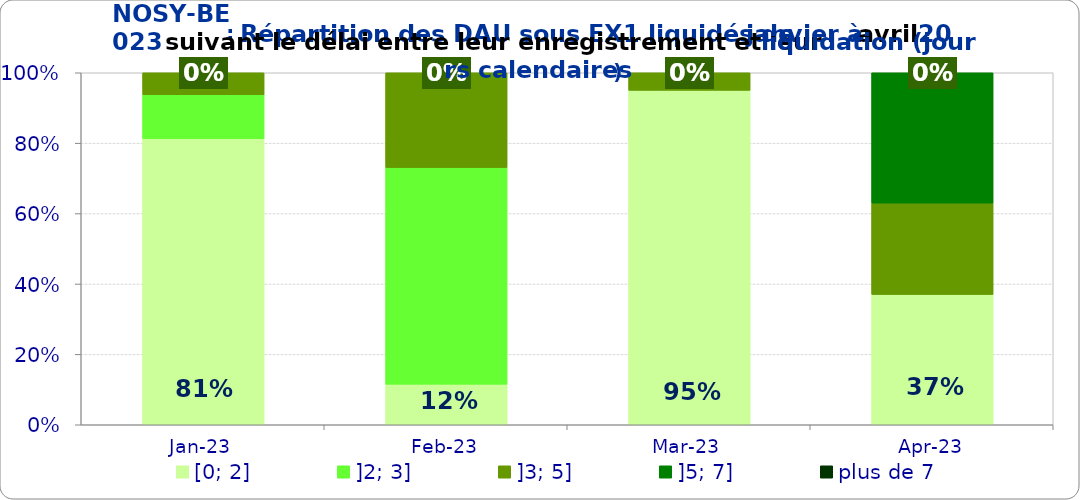
| Category | [0; 2] | ]2; 3] | ]3; 5] | ]5; 7] | plus de 7 |
|---|---|---|---|---|---|
| 2023-01-01 | 0.812 | 0.125 | 0.062 | 0 | 0 |
| 2023-02-01 | 0.115 | 0.615 | 0.269 | 0 | 0 |
| 2023-03-01 | 0.95 | 0 | 0.05 | 0 | 0 |
| 2023-04-01 | 0.37 | 0 | 0.259 | 0.37 | 0 |